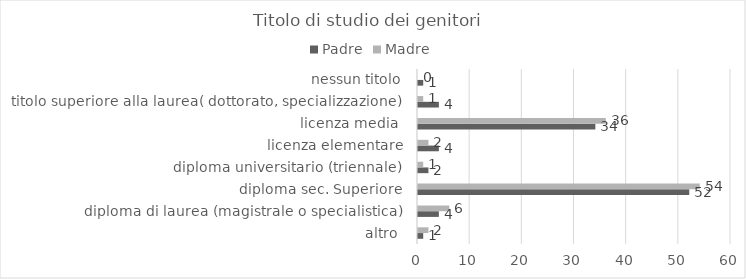
| Category | Padre | Madre |
|---|---|---|
| altro  | 1 | 2 |
| diploma di laurea (magistrale o specialistica) | 4 | 6 |
| diploma sec. Superiore | 52 | 54 |
| diploma universitario (triennale) | 2 | 1 |
| licenza elementare | 4 | 2 |
| licenza media  | 34 | 36 |
| titolo superiore alla laurea( dottorato, specializzazione) | 4 | 1 |
| nessun titolo | 1 | 0 |